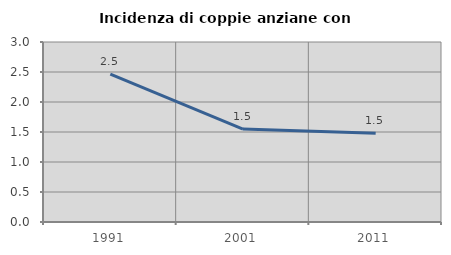
| Category | Incidenza di coppie anziane con figli |
|---|---|
| 1991.0 | 2.465 |
| 2001.0 | 1.548 |
| 2011.0 | 1.479 |